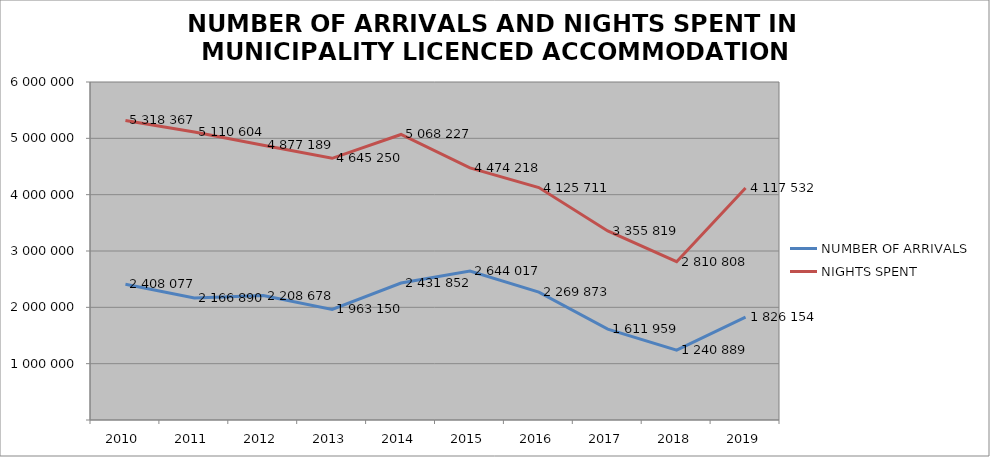
| Category | NUMBER OF ARRIVALS | NIGHTS SPENT |
|---|---|---|
| 2010 | 2408077 | 5318367 |
| 2011 | 2166890 | 5110604 |
| 2012 | 2208678 | 4877189 |
| 2013 | 1963150 | 4645250 |
| 2014 | 2431852 | 5068227 |
| 2015 | 2644017 | 4474218 |
| 2016 | 2269873 | 4125711 |
| 2017 | 1611959 | 3355819 |
| 2018 | 1240889 | 2810808 |
| 2019 | 1826154 | 4117532 |